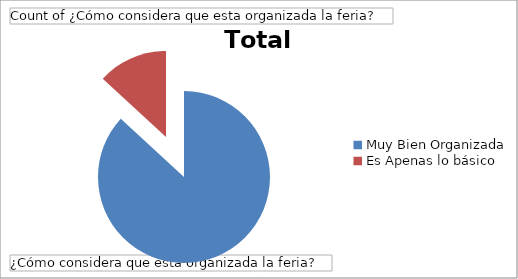
| Category | Total |
|---|---|
| Muy Bien Organizada | 185 |
| Es Apenas lo básico | 28 |